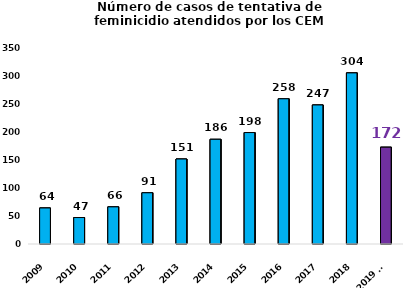
| Category | Tentativa de feminicidio |
|---|---|
| 2009 | 64 |
| 2010 | 47 |
| 2011 | 66 |
| 2012 | 91 |
| 2013 | 151 |
| 2014 | 186 |
| 2015 | 198 |
| 2016 | 258 |
| 2017 | 247 |
| 2018 | 304 |
| 2019 a/ | 172 |